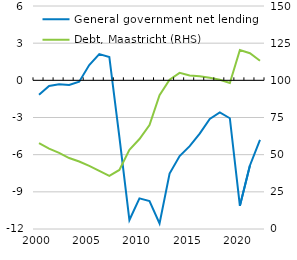
| Category | General government net lending |
|---|---|
| 2000.0 | -1.161 |
| 2001.0 | -0.455 |
| 2002.0 | -0.317 |
| 2003.0 | -0.375 |
| 2004.0 | -0.109 |
| 2005.0 | 1.232 |
| 2006.0 | 2.124 |
| 2007.0 | 1.886 |
| 2008.0 | -4.572 |
| 2009.0 | -11.276 |
| 2010.0 | -9.527 |
| 2011.0 | -9.74 |
| 2012.0 | -11.551 |
| 2013.0 | -7.528 |
| 2014.0 | -6.11 |
| 2015.0 | -5.309 |
| 2016.0 | -4.298 |
| 2017.0 | -3.116 |
| 2018.0 | -2.594 |
| 2019.0 | -3.06 |
| 2020.0 | -10.125 |
| 2021.0 | -6.873 |
| 2022.0 | -4.806 |